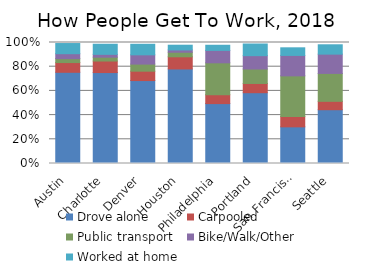
| Category | Drove alone | Carpooled | Public transport | Bike/Walk/Other | Worked at home |
|---|---|---|---|---|---|
| Austin | 0.754 | 0.08 | 0.032 | 0.041 | 0.084 |
| Charlotte | 0.752 | 0.095 | 0.032 | 0.023 | 0.084 |
| Denver | 0.685 | 0.078 | 0.059 | 0.077 | 0.087 |
| Houston | 0.781 | 0.1 | 0.038 | 0.019 | 0.039 |
| Philadelphia | 0.495 | 0.073 | 0.264 | 0.103 | 0.043 |
| Portland | 0.585 | 0.076 | 0.12 | 0.11 | 0.096 |
| San Francisco | 0.303 | 0.086 | 0.335 | 0.169 | 0.063 |
| Seattle | 0.444 | 0.069 | 0.231 | 0.159 | 0.077 |